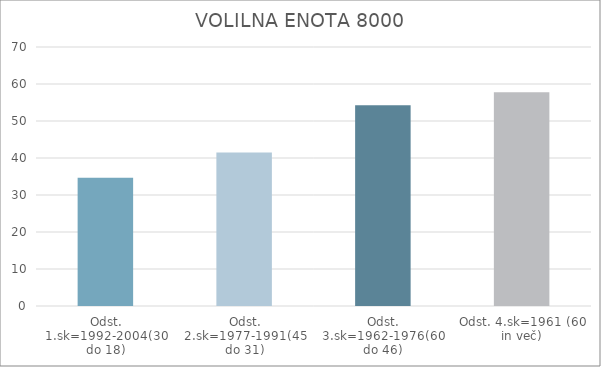
| Category | Series 0 |
|---|---|
| Odst. 1.sk=1992-2004(30 do 18) | 34.69 |
| Odst. 2.sk=1977-1991(45 do 31) | 41.48 |
| Odst. 3.sk=1962-1976(60 do 46) | 54.23 |
| Odst. 4.sk=1961 (60 in več) | 57.8 |